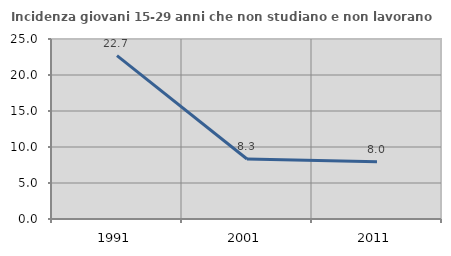
| Category | Incidenza giovani 15-29 anni che non studiano e non lavorano  |
|---|---|
| 1991.0 | 22.699 |
| 2001.0 | 8.333 |
| 2011.0 | 7.955 |